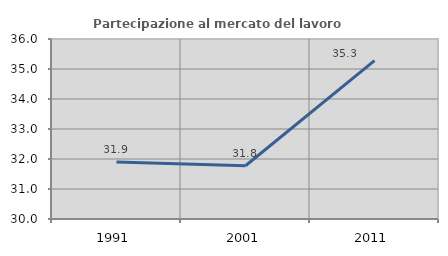
| Category | Partecipazione al mercato del lavoro  femminile |
|---|---|
| 1991.0 | 31.897 |
| 2001.0 | 31.776 |
| 2011.0 | 35.277 |